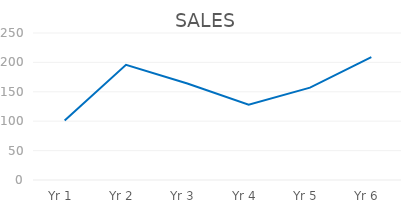
| Category | Series 0 |
|---|---|
| 1.0 | 101 |
| 2.0 | 196 |
| 3.0 | 164 |
| 4.0 | 128 |
| 5.0 | 157 |
| 6.0 | 209 |